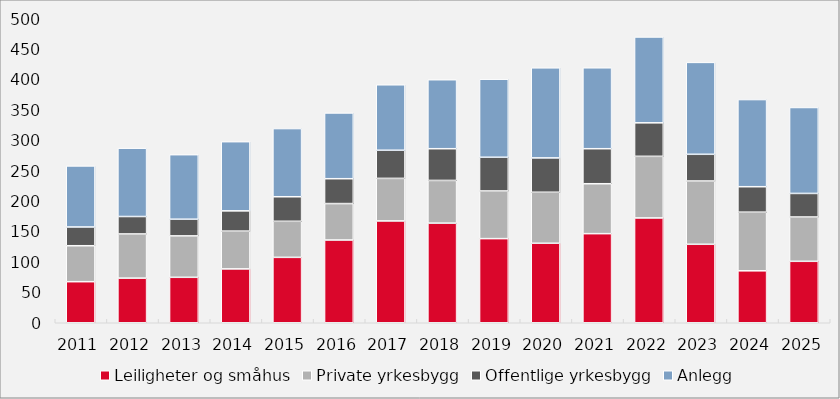
| Category | Leiligheter og småhus | Private yrkesbygg | Offentlige yrkesbygg | Anlegg |
|---|---|---|---|---|
| 2011.0 | 67.55 | 59.136 | 30.84 | 100.42 |
| 2012.0 | 73.399 | 72.657 | 28.674 | 112.4 |
| 2013.0 | 74.747 | 68.126 | 27.416 | 106.158 |
| 2014.0 | 88.597 | 62.131 | 33.327 | 113.788 |
| 2015.0 | 107.573 | 59.312 | 40.373 | 112.147 |
| 2016.0 | 136.112 | 59.903 | 40.894 | 108.156 |
| 2017.0 | 167.497 | 69.96 | 46.283 | 107.666 |
| 2018.0 | 163.85 | 70.229 | 52.161 | 113.505 |
| 2019.0 | 138.371 | 78.398 | 55.421 | 128.39 |
| 2020.0 | 130.741 | 83.922 | 56.487 | 148.136 |
| 2021.0 | 146.538 | 82.124 | 57.59 | 133.121 |
| 2022.0 | 172.404 | 101.34 | 55.086 | 141.219 |
| 2023.0 | 129.066 | 104.098 | 43.922 | 151.153 |
| 2024.0 | 85.433 | 96.439 | 41.877 | 143.346 |
| 2025.0 | 101.053 | 72.879 | 38.76 | 141.354 |